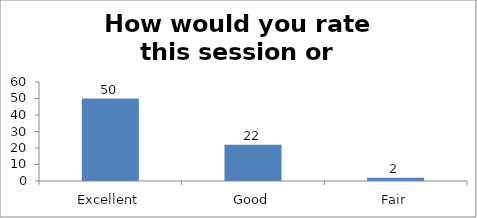
| Category | How would you rate this session or workshop? |
|---|---|
| Excellent | 50 |
| Good | 22 |
| Fair | 2 |